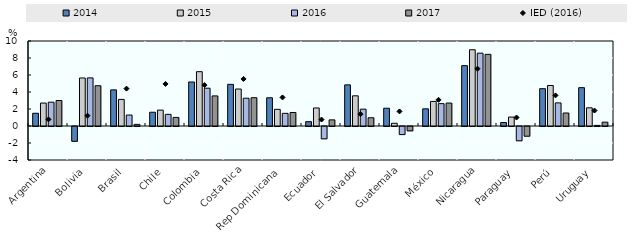
| Category | 2014 | 2015 | 2016 | 2017 |
|---|---|---|---|---|
| Argentina | 1.5 | 2.7 | 2.8 | 3 |
| Bolivia | -1.74 | 5.65 | 5.66 | 4.74 |
| Brasil | 4.25 | 3.13 | 1.29 | 0.19 |
| Chile | 1.62 | 1.87 | 1.37 | 1.01 |
| Colombia | 5.18 | 6.39 | 4.45 | 3.54 |
| Costa Rica | 4.9 | 4.35 | 3.27 | 3.33 |
| Rep Dominicana | 3.32 | 1.96 | 1.49 | 1.59 |
| Ecuador | 0.51 | 2.12 | -1.45 | 0.72 |
| El Salvador | 4.84 | 3.55 | 1.98 | 0.97 |
| Guatemala | 2.09 | 0.32 | -0.95 | -0.51 |
| México | 2.02 | 2.89 | 2.63 | 2.7 |
| Nicaragua | 7.1 | 8.97 | 8.57 | 8.43 |
| Paraguay | 0.41 | 1.05 | -1.68 | -1.14 |
| Perú | 4.39 | 4.77 | 2.72 | 1.53 |
| Uruguay | 4.51 | 2.14 | 0.07 | 0.45 |